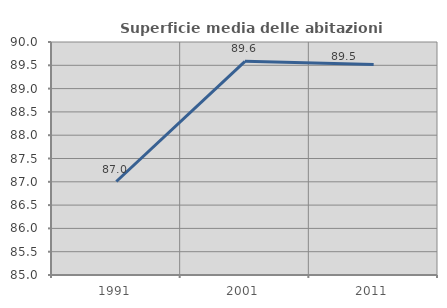
| Category | Superficie media delle abitazioni occupate |
|---|---|
| 1991.0 | 87.006 |
| 2001.0 | 89.586 |
| 2011.0 | 89.52 |